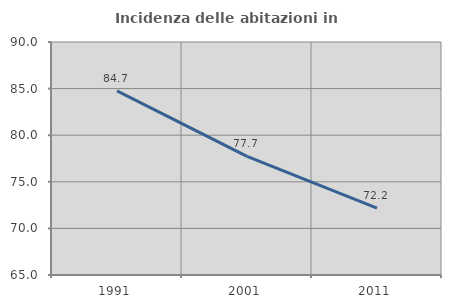
| Category | Incidenza delle abitazioni in proprietà  |
|---|---|
| 1991.0 | 84.748 |
| 2001.0 | 77.723 |
| 2011.0 | 72.175 |